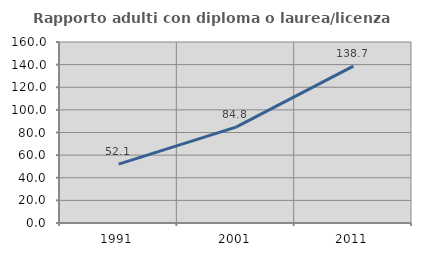
| Category | Rapporto adulti con diploma o laurea/licenza media  |
|---|---|
| 1991.0 | 52.068 |
| 2001.0 | 84.809 |
| 2011.0 | 138.689 |